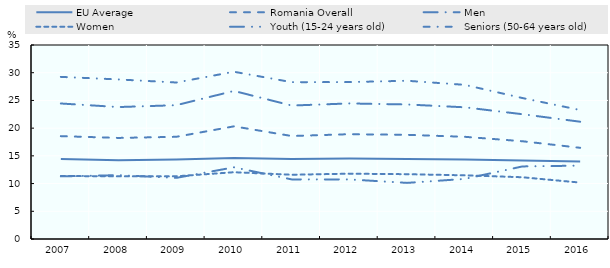
| Category | EU Average | Romania Overall | Men | Women | Youth (15-24 years old) | Seniors (50-64 years old) |
|---|---|---|---|---|---|---|
| 2007.0 | 14.419 | 18.558 | 24.446 | 11.364 | 11.299 | 29.248 |
| 2008.0 | 14.216 | 18.235 | 23.805 | 11.305 | 11.519 | 28.786 |
| 2009.0 | 14.333 | 18.436 | 24.139 | 11.312 | 11.027 | 28.234 |
| 2010.0 | 14.595 | 20.325 | 26.712 | 12.048 | 12.929 | 30.173 |
| 2011.0 | 14.446 | 18.579 | 24.076 | 11.592 | 10.752 | 28.296 |
| 2012.0 | 14.502 | 18.909 | 24.458 | 11.784 | 10.75 | 28.309 |
| 2013.0 | 14.418 | 18.797 | 24.269 | 11.692 | 10.123 | 28.549 |
| 2014.0 | 14.354 | 18.439 | 23.759 | 11.486 | 10.842 | 27.811 |
| 2015.0 | 14.148 | 17.636 | 22.512 | 11.14 | 13.095 | 25.43 |
| 2016.0 | 13.986 | 16.455 | 21.159 | 10.178 | 13.237 | 23.272 |